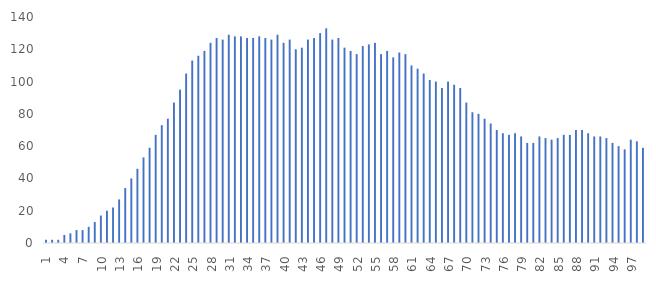
| Category | Observations |
|---|---|
| 1.0 | 2 |
| 2.0 | 2 |
| 3.0 | 2 |
| 4.0 | 5 |
| 5.0 | 6 |
| 6.0 | 8 |
| 7.0 | 8 |
| 8.0 | 10 |
| 9.0 | 13 |
| 10.0 | 17 |
| 11.0 | 20 |
| 12.0 | 22 |
| 13.0 | 27 |
| 14.0 | 34 |
| 15.0 | 40 |
| 16.0 | 46 |
| 17.0 | 53 |
| 18.0 | 59 |
| 19.0 | 67 |
| 20.0 | 73 |
| 21.0 | 77 |
| 22.0 | 87 |
| 23.0 | 95 |
| 24.0 | 105 |
| 25.0 | 113 |
| 26.0 | 116 |
| 27.0 | 119 |
| 28.0 | 124 |
| 29.0 | 127 |
| 30.0 | 126 |
| 31.0 | 129 |
| 32.0 | 128 |
| 33.0 | 128 |
| 34.0 | 127 |
| 35.0 | 127 |
| 36.0 | 128 |
| 37.0 | 127 |
| 38.0 | 126 |
| 39.0 | 129 |
| 40.0 | 124 |
| 41.0 | 126 |
| 42.0 | 120 |
| 43.0 | 121 |
| 44.0 | 126 |
| 45.0 | 127 |
| 46.0 | 130 |
| 47.0 | 133 |
| 48.0 | 126 |
| 49.0 | 127 |
| 50.0 | 121 |
| 51.0 | 119 |
| 52.0 | 117 |
| 53.0 | 122 |
| 54.0 | 123 |
| 55.0 | 124 |
| 56.0 | 117 |
| 57.0 | 119 |
| 58.0 | 115 |
| 59.0 | 118 |
| 60.0 | 117 |
| 61.0 | 110 |
| 62.0 | 108 |
| 63.0 | 105 |
| 64.0 | 101 |
| 65.0 | 100 |
| 66.0 | 96 |
| 67.0 | 100 |
| 68.0 | 98 |
| 69.0 | 96 |
| 70.0 | 87 |
| 71.0 | 81 |
| 72.0 | 80 |
| 73.0 | 77 |
| 74.0 | 74 |
| 75.0 | 70 |
| 76.0 | 68 |
| 77.0 | 67 |
| 78.0 | 68 |
| 79.0 | 66 |
| 80.0 | 62 |
| 81.0 | 62 |
| 82.0 | 66 |
| 83.0 | 65 |
| 84.0 | 64 |
| 85.0 | 65 |
| 86.0 | 67 |
| 87.0 | 67 |
| 88.0 | 70 |
| 89.0 | 70 |
| 90.0 | 68 |
| 91.0 | 66 |
| 92.0 | 66 |
| 93.0 | 65 |
| 94.0 | 62 |
| 95.0 | 60 |
| 96.0 | 58 |
| 97.0 | 64 |
| 98.0 | 63 |
| 99.0 | 59 |